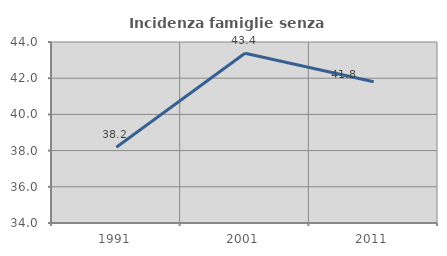
| Category | Incidenza famiglie senza nuclei |
|---|---|
| 1991.0 | 38.182 |
| 2001.0 | 43.38 |
| 2011.0 | 41.801 |